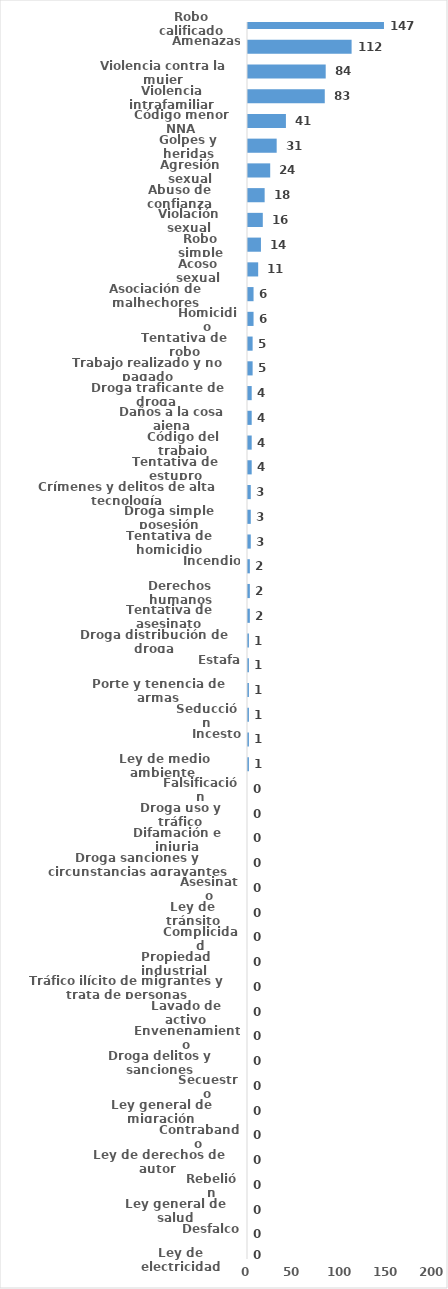
| Category | Series 0 |
|---|---|
| Robo calificado | 147 |
| Amenazas | 112 |
| Violencia contra la mujer | 84 |
| Violencia intrafamiliar | 83 |
| Código menor NNA | 41 |
| Golpes y heridas | 31 |
| Agresión sexual | 24 |
| Abuso de confianza | 18 |
| Violación sexual | 16 |
| Robo simple | 14 |
| Acoso sexual | 11 |
| Asociación de malhechores | 6 |
| Homicidio | 6 |
| Tentativa de robo | 5 |
| Trabajo realizado y no pagado | 5 |
| Droga traficante de droga  | 4 |
| Daños a la cosa ajena | 4 |
| Código del trabajo | 4 |
| Tentativa de estupro | 4 |
| Crímenes y delitos de alta tecnología | 3 |
| Droga simple posesión | 3 |
| Tentativa de homicidio | 3 |
| Incendio | 2 |
| Derechos humanos | 2 |
| Tentativa de asesinato | 2 |
| Droga distribución de droga | 1 |
| Estafa | 1 |
| Porte y tenencia de armas | 1 |
| Seducción | 1 |
| Incesto | 1 |
| Ley de medio ambiente  | 1 |
| Falsificación | 0 |
| Droga uso y tráfico | 0 |
| Difamación e injuria | 0 |
| Droga sanciones y circunstancias agravantes | 0 |
| Asesinato | 0 |
| Ley de tránsito | 0 |
| Complicidad | 0 |
| Propiedad industrial  | 0 |
| Tráfico ilícito de migrantes y trata de personas | 0 |
| Lavado de activo | 0 |
| Envenenamiento | 0 |
| Droga delitos y sanciones | 0 |
| Secuestro | 0 |
| Ley general de migración | 0 |
| Contrabando | 0 |
| Ley de derechos de autor  | 0 |
| Rebelión | 0 |
| Ley general de salud | 0 |
| Desfalco | 0 |
| Ley de electricidad | 0 |